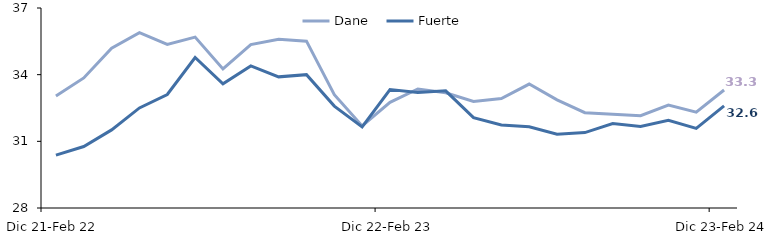
| Category | Dane | Fuerte |
|---|---|---|
| Dic 21-Feb 22 | 33.041 | 30.38 |
| Ene-Mar 2022 | 33.853 | 30.767 |
| Feb-Abr 2022 | 35.191 | 31.514 |
| Mar-May 2022 | 35.889 | 32.503 |
| Abr-Jun 2022 | 35.359 | 33.107 |
| May-Jul 2022 | 35.69 | 34.772 |
| Jun-Ago 2022 | 34.26 | 33.587 |
| Jul-Sep 2022 | 35.355 | 34.394 |
| Ago-Oct 2022 | 35.598 | 33.901 |
| Sep-Nov 2022 | 35.509 | 34 |
| Oct-Dic 2022 | 33.098 | 32.587 |
| Nov 22-Ene 23 | 31.695 | 31.645 |
| Dic 22-Feb 23 | 32.755 | 33.33 |
| Ene-Mar 2023 | 33.356 | 33.203 |
| Feb-Abr 2023 | 33.183 | 33.273 |
| Mar-May 2023 | 32.797 | 32.069 |
| Abr-Jun 2023 | 32.925 | 31.736 |
| May-Jul 2023 | 33.578 | 31.652 |
| Jun-Ago 2023 | 32.867 | 31.318 |
| Jul-Sep 2023 | 32.29 | 31.395 |
| Ago-Oct 2023 | 32.217 | 31.803 |
| Sep-Nov 2023 | 32.155 | 31.666 |
| Oct-Dic 2023 | 32.631 | 31.947 |
| Nov 23-Ene 24 | 32.312 | 31.581 |
| Dic 23-Feb 24 | 33.31 | 32.598 |